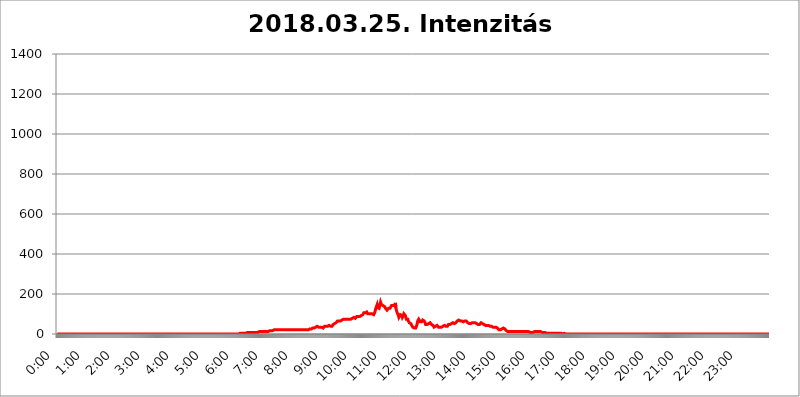
| Category | 2018.03.25. Intenzitás [W/m^2] |
|---|---|
| 0.0 | 0 |
| 0.0006944444444444445 | 0 |
| 0.001388888888888889 | 0 |
| 0.0020833333333333333 | 0 |
| 0.002777777777777778 | 0 |
| 0.003472222222222222 | 0 |
| 0.004166666666666667 | 0 |
| 0.004861111111111111 | 0 |
| 0.005555555555555556 | 0 |
| 0.0062499999999999995 | 0 |
| 0.006944444444444444 | 0 |
| 0.007638888888888889 | 0 |
| 0.008333333333333333 | 0 |
| 0.009027777777777779 | 0 |
| 0.009722222222222222 | 0 |
| 0.010416666666666666 | 0 |
| 0.011111111111111112 | 0 |
| 0.011805555555555555 | 0 |
| 0.012499999999999999 | 0 |
| 0.013194444444444444 | 0 |
| 0.013888888888888888 | 0 |
| 0.014583333333333332 | 0 |
| 0.015277777777777777 | 0 |
| 0.015972222222222224 | 0 |
| 0.016666666666666666 | 0 |
| 0.017361111111111112 | 0 |
| 0.018055555555555557 | 0 |
| 0.01875 | 0 |
| 0.019444444444444445 | 0 |
| 0.02013888888888889 | 0 |
| 0.020833333333333332 | 0 |
| 0.02152777777777778 | 0 |
| 0.022222222222222223 | 0 |
| 0.02291666666666667 | 0 |
| 0.02361111111111111 | 0 |
| 0.024305555555555556 | 0 |
| 0.024999999999999998 | 0 |
| 0.025694444444444447 | 0 |
| 0.02638888888888889 | 0 |
| 0.027083333333333334 | 0 |
| 0.027777777777777776 | 0 |
| 0.02847222222222222 | 0 |
| 0.029166666666666664 | 0 |
| 0.029861111111111113 | 0 |
| 0.030555555555555555 | 0 |
| 0.03125 | 0 |
| 0.03194444444444445 | 0 |
| 0.03263888888888889 | 0 |
| 0.03333333333333333 | 0 |
| 0.034027777777777775 | 0 |
| 0.034722222222222224 | 0 |
| 0.035416666666666666 | 0 |
| 0.036111111111111115 | 0 |
| 0.03680555555555556 | 0 |
| 0.0375 | 0 |
| 0.03819444444444444 | 0 |
| 0.03888888888888889 | 0 |
| 0.03958333333333333 | 0 |
| 0.04027777777777778 | 0 |
| 0.04097222222222222 | 0 |
| 0.041666666666666664 | 0 |
| 0.042361111111111106 | 0 |
| 0.04305555555555556 | 0 |
| 0.043750000000000004 | 0 |
| 0.044444444444444446 | 0 |
| 0.04513888888888889 | 0 |
| 0.04583333333333334 | 0 |
| 0.04652777777777778 | 0 |
| 0.04722222222222222 | 0 |
| 0.04791666666666666 | 0 |
| 0.04861111111111111 | 0 |
| 0.049305555555555554 | 0 |
| 0.049999999999999996 | 0 |
| 0.05069444444444445 | 0 |
| 0.051388888888888894 | 0 |
| 0.052083333333333336 | 0 |
| 0.05277777777777778 | 0 |
| 0.05347222222222222 | 0 |
| 0.05416666666666667 | 0 |
| 0.05486111111111111 | 0 |
| 0.05555555555555555 | 0 |
| 0.05625 | 0 |
| 0.05694444444444444 | 0 |
| 0.057638888888888885 | 0 |
| 0.05833333333333333 | 0 |
| 0.05902777777777778 | 0 |
| 0.059722222222222225 | 0 |
| 0.06041666666666667 | 0 |
| 0.061111111111111116 | 0 |
| 0.06180555555555556 | 0 |
| 0.0625 | 0 |
| 0.06319444444444444 | 0 |
| 0.06388888888888888 | 0 |
| 0.06458333333333334 | 0 |
| 0.06527777777777778 | 0 |
| 0.06597222222222222 | 0 |
| 0.06666666666666667 | 0 |
| 0.06736111111111111 | 0 |
| 0.06805555555555555 | 0 |
| 0.06874999999999999 | 0 |
| 0.06944444444444443 | 0 |
| 0.07013888888888889 | 0 |
| 0.07083333333333333 | 0 |
| 0.07152777777777779 | 0 |
| 0.07222222222222223 | 0 |
| 0.07291666666666667 | 0 |
| 0.07361111111111111 | 0 |
| 0.07430555555555556 | 0 |
| 0.075 | 0 |
| 0.07569444444444444 | 0 |
| 0.0763888888888889 | 0 |
| 0.07708333333333334 | 0 |
| 0.07777777777777778 | 0 |
| 0.07847222222222222 | 0 |
| 0.07916666666666666 | 0 |
| 0.0798611111111111 | 0 |
| 0.08055555555555556 | 0 |
| 0.08125 | 0 |
| 0.08194444444444444 | 0 |
| 0.08263888888888889 | 0 |
| 0.08333333333333333 | 0 |
| 0.08402777777777777 | 0 |
| 0.08472222222222221 | 0 |
| 0.08541666666666665 | 0 |
| 0.08611111111111112 | 0 |
| 0.08680555555555557 | 0 |
| 0.08750000000000001 | 0 |
| 0.08819444444444445 | 0 |
| 0.08888888888888889 | 0 |
| 0.08958333333333333 | 0 |
| 0.09027777777777778 | 0 |
| 0.09097222222222222 | 0 |
| 0.09166666666666667 | 0 |
| 0.09236111111111112 | 0 |
| 0.09305555555555556 | 0 |
| 0.09375 | 0 |
| 0.09444444444444444 | 0 |
| 0.09513888888888888 | 0 |
| 0.09583333333333333 | 0 |
| 0.09652777777777777 | 0 |
| 0.09722222222222222 | 0 |
| 0.09791666666666667 | 0 |
| 0.09861111111111111 | 0 |
| 0.09930555555555555 | 0 |
| 0.09999999999999999 | 0 |
| 0.10069444444444443 | 0 |
| 0.1013888888888889 | 0 |
| 0.10208333333333335 | 0 |
| 0.10277777777777779 | 0 |
| 0.10347222222222223 | 0 |
| 0.10416666666666667 | 0 |
| 0.10486111111111111 | 0 |
| 0.10555555555555556 | 0 |
| 0.10625 | 0 |
| 0.10694444444444444 | 0 |
| 0.1076388888888889 | 0 |
| 0.10833333333333334 | 0 |
| 0.10902777777777778 | 0 |
| 0.10972222222222222 | 0 |
| 0.1111111111111111 | 0 |
| 0.11180555555555556 | 0 |
| 0.11180555555555556 | 0 |
| 0.1125 | 0 |
| 0.11319444444444444 | 0 |
| 0.11388888888888889 | 0 |
| 0.11458333333333333 | 0 |
| 0.11527777777777777 | 0 |
| 0.11597222222222221 | 0 |
| 0.11666666666666665 | 0 |
| 0.1173611111111111 | 0 |
| 0.11805555555555557 | 0 |
| 0.11944444444444445 | 0 |
| 0.12013888888888889 | 0 |
| 0.12083333333333333 | 0 |
| 0.12152777777777778 | 0 |
| 0.12222222222222223 | 0 |
| 0.12291666666666667 | 0 |
| 0.12291666666666667 | 0 |
| 0.12361111111111112 | 0 |
| 0.12430555555555556 | 0 |
| 0.125 | 0 |
| 0.12569444444444444 | 0 |
| 0.12638888888888888 | 0 |
| 0.12708333333333333 | 0 |
| 0.16875 | 0 |
| 0.12847222222222224 | 0 |
| 0.12916666666666668 | 0 |
| 0.12986111111111112 | 0 |
| 0.13055555555555556 | 0 |
| 0.13125 | 0 |
| 0.13194444444444445 | 0 |
| 0.1326388888888889 | 0 |
| 0.13333333333333333 | 0 |
| 0.13402777777777777 | 0 |
| 0.13402777777777777 | 0 |
| 0.13472222222222222 | 0 |
| 0.13541666666666666 | 0 |
| 0.1361111111111111 | 0 |
| 0.13749999999999998 | 0 |
| 0.13819444444444443 | 0 |
| 0.1388888888888889 | 0 |
| 0.13958333333333334 | 0 |
| 0.14027777777777778 | 0 |
| 0.14097222222222222 | 0 |
| 0.14166666666666666 | 0 |
| 0.1423611111111111 | 0 |
| 0.14305555555555557 | 0 |
| 0.14375000000000002 | 0 |
| 0.14444444444444446 | 0 |
| 0.1451388888888889 | 0 |
| 0.1451388888888889 | 0 |
| 0.14652777777777778 | 0 |
| 0.14722222222222223 | 0 |
| 0.14791666666666667 | 0 |
| 0.1486111111111111 | 0 |
| 0.14930555555555555 | 0 |
| 0.15 | 0 |
| 0.15069444444444444 | 0 |
| 0.15138888888888888 | 0 |
| 0.15208333333333332 | 0 |
| 0.15277777777777776 | 0 |
| 0.15347222222222223 | 0 |
| 0.15416666666666667 | 0 |
| 0.15486111111111112 | 0 |
| 0.15555555555555556 | 0 |
| 0.15625 | 0 |
| 0.15694444444444444 | 0 |
| 0.15763888888888888 | 0 |
| 0.15833333333333333 | 0 |
| 0.15902777777777777 | 0 |
| 0.15972222222222224 | 0 |
| 0.16041666666666668 | 0 |
| 0.16111111111111112 | 0 |
| 0.16180555555555556 | 0 |
| 0.1625 | 0 |
| 0.16319444444444445 | 0 |
| 0.1638888888888889 | 0 |
| 0.16458333333333333 | 0 |
| 0.16527777777777777 | 0 |
| 0.16597222222222222 | 0 |
| 0.16666666666666666 | 0 |
| 0.1673611111111111 | 0 |
| 0.16805555555555554 | 0 |
| 0.16874999999999998 | 0 |
| 0.16944444444444443 | 0 |
| 0.17013888888888887 | 0 |
| 0.1708333333333333 | 0 |
| 0.17152777777777775 | 0 |
| 0.17222222222222225 | 0 |
| 0.1729166666666667 | 0 |
| 0.17361111111111113 | 0 |
| 0.17430555555555557 | 0 |
| 0.17500000000000002 | 0 |
| 0.17569444444444446 | 0 |
| 0.1763888888888889 | 0 |
| 0.17708333333333334 | 0 |
| 0.17777777777777778 | 0 |
| 0.17847222222222223 | 0 |
| 0.17916666666666667 | 0 |
| 0.1798611111111111 | 0 |
| 0.18055555555555555 | 0 |
| 0.18125 | 0 |
| 0.18194444444444444 | 0 |
| 0.1826388888888889 | 0 |
| 0.18333333333333335 | 0 |
| 0.1840277777777778 | 0 |
| 0.18472222222222223 | 0 |
| 0.18541666666666667 | 0 |
| 0.18611111111111112 | 0 |
| 0.18680555555555556 | 0 |
| 0.1875 | 0 |
| 0.18819444444444444 | 0 |
| 0.18888888888888888 | 0 |
| 0.18958333333333333 | 0 |
| 0.19027777777777777 | 0 |
| 0.1909722222222222 | 0 |
| 0.19166666666666665 | 0 |
| 0.19236111111111112 | 0 |
| 0.19305555555555554 | 0 |
| 0.19375 | 0 |
| 0.19444444444444445 | 0 |
| 0.1951388888888889 | 0 |
| 0.19583333333333333 | 0 |
| 0.19652777777777777 | 0 |
| 0.19722222222222222 | 0 |
| 0.19791666666666666 | 0 |
| 0.1986111111111111 | 0 |
| 0.19930555555555554 | 0 |
| 0.19999999999999998 | 0 |
| 0.20069444444444443 | 0 |
| 0.20138888888888887 | 0 |
| 0.2020833333333333 | 0 |
| 0.2027777777777778 | 0 |
| 0.2034722222222222 | 0 |
| 0.2041666666666667 | 0 |
| 0.20486111111111113 | 0 |
| 0.20555555555555557 | 0 |
| 0.20625000000000002 | 0 |
| 0.20694444444444446 | 0 |
| 0.2076388888888889 | 0 |
| 0.20833333333333334 | 0 |
| 0.20902777777777778 | 0 |
| 0.20972222222222223 | 0 |
| 0.21041666666666667 | 0 |
| 0.2111111111111111 | 0 |
| 0.21180555555555555 | 0 |
| 0.2125 | 0 |
| 0.21319444444444444 | 0 |
| 0.2138888888888889 | 0 |
| 0.21458333333333335 | 0 |
| 0.2152777777777778 | 0 |
| 0.21597222222222223 | 0 |
| 0.21666666666666667 | 0 |
| 0.21736111111111112 | 0 |
| 0.21805555555555556 | 0 |
| 0.21875 | 0 |
| 0.21944444444444444 | 0 |
| 0.22013888888888888 | 0 |
| 0.22083333333333333 | 0 |
| 0.22152777777777777 | 0 |
| 0.2222222222222222 | 0 |
| 0.22291666666666665 | 0 |
| 0.2236111111111111 | 0 |
| 0.22430555555555556 | 0 |
| 0.225 | 0 |
| 0.22569444444444445 | 0 |
| 0.2263888888888889 | 0 |
| 0.22708333333333333 | 0 |
| 0.22777777777777777 | 0 |
| 0.22847222222222222 | 0 |
| 0.22916666666666666 | 0 |
| 0.2298611111111111 | 0 |
| 0.23055555555555554 | 0 |
| 0.23124999999999998 | 0 |
| 0.23194444444444443 | 0 |
| 0.23263888888888887 | 0 |
| 0.2333333333333333 | 0 |
| 0.2340277777777778 | 0 |
| 0.2347222222222222 | 0 |
| 0.2354166666666667 | 0 |
| 0.23611111111111113 | 0 |
| 0.23680555555555557 | 0 |
| 0.23750000000000002 | 0 |
| 0.23819444444444446 | 0 |
| 0.2388888888888889 | 0 |
| 0.23958333333333334 | 0 |
| 0.24027777777777778 | 0 |
| 0.24097222222222223 | 0 |
| 0.24166666666666667 | 0 |
| 0.2423611111111111 | 0 |
| 0.24305555555555555 | 0 |
| 0.24375 | 0 |
| 0.24444444444444446 | 0 |
| 0.24513888888888888 | 0 |
| 0.24583333333333335 | 0 |
| 0.2465277777777778 | 0 |
| 0.24722222222222223 | 0 |
| 0.24791666666666667 | 0 |
| 0.24861111111111112 | 0 |
| 0.24930555555555556 | 0 |
| 0.25 | 0 |
| 0.25069444444444444 | 0 |
| 0.2513888888888889 | 0 |
| 0.2520833333333333 | 0 |
| 0.25277777777777777 | 0 |
| 0.2534722222222222 | 0 |
| 0.25416666666666665 | 0 |
| 0.2548611111111111 | 3.525 |
| 0.2555555555555556 | 3.525 |
| 0.25625000000000003 | 3.525 |
| 0.2569444444444445 | 3.525 |
| 0.2576388888888889 | 3.525 |
| 0.25833333333333336 | 3.525 |
| 0.2590277777777778 | 3.525 |
| 0.25972222222222224 | 3.525 |
| 0.2604166666666667 | 3.525 |
| 0.2611111111111111 | 3.525 |
| 0.26180555555555557 | 3.525 |
| 0.2625 | 3.525 |
| 0.26319444444444445 | 3.525 |
| 0.2638888888888889 | 3.525 |
| 0.26458333333333334 | 3.525 |
| 0.2652777777777778 | 3.525 |
| 0.2659722222222222 | 3.525 |
| 0.26666666666666666 | 7.887 |
| 0.2673611111111111 | 7.887 |
| 0.26805555555555555 | 7.887 |
| 0.26875 | 7.887 |
| 0.26944444444444443 | 7.887 |
| 0.2701388888888889 | 7.887 |
| 0.2708333333333333 | 7.887 |
| 0.27152777777777776 | 7.887 |
| 0.2722222222222222 | 7.887 |
| 0.27291666666666664 | 7.887 |
| 0.2736111111111111 | 7.887 |
| 0.2743055555555555 | 7.887 |
| 0.27499999999999997 | 7.887 |
| 0.27569444444444446 | 7.887 |
| 0.27638888888888885 | 7.887 |
| 0.27708333333333335 | 7.887 |
| 0.2777777777777778 | 7.887 |
| 0.27847222222222223 | 7.887 |
| 0.2791666666666667 | 7.887 |
| 0.2798611111111111 | 7.887 |
| 0.28055555555555556 | 7.887 |
| 0.28125 | 7.887 |
| 0.28194444444444444 | 12.257 |
| 0.2826388888888889 | 7.887 |
| 0.2833333333333333 | 12.257 |
| 0.28402777777777777 | 12.257 |
| 0.2847222222222222 | 12.257 |
| 0.28541666666666665 | 12.257 |
| 0.28611111111111115 | 12.257 |
| 0.28680555555555554 | 12.257 |
| 0.28750000000000003 | 12.257 |
| 0.2881944444444445 | 12.257 |
| 0.2888888888888889 | 12.257 |
| 0.28958333333333336 | 12.257 |
| 0.2902777777777778 | 12.257 |
| 0.29097222222222224 | 12.257 |
| 0.2916666666666667 | 12.257 |
| 0.2923611111111111 | 12.257 |
| 0.29305555555555557 | 12.257 |
| 0.29375 | 12.257 |
| 0.29444444444444445 | 12.257 |
| 0.2951388888888889 | 12.257 |
| 0.29583333333333334 | 12.257 |
| 0.2965277777777778 | 16.636 |
| 0.2972222222222222 | 16.636 |
| 0.29791666666666666 | 16.636 |
| 0.2986111111111111 | 16.636 |
| 0.29930555555555555 | 16.636 |
| 0.3 | 16.636 |
| 0.30069444444444443 | 16.636 |
| 0.3013888888888889 | 16.636 |
| 0.3020833333333333 | 16.636 |
| 0.30277777777777776 | 16.636 |
| 0.3034722222222222 | 16.636 |
| 0.30416666666666664 | 21.024 |
| 0.3048611111111111 | 16.636 |
| 0.3055555555555555 | 21.024 |
| 0.30624999999999997 | 21.024 |
| 0.3069444444444444 | 21.024 |
| 0.3076388888888889 | 16.636 |
| 0.30833333333333335 | 21.024 |
| 0.3090277777777778 | 21.024 |
| 0.30972222222222223 | 21.024 |
| 0.3104166666666667 | 21.024 |
| 0.3111111111111111 | 21.024 |
| 0.31180555555555556 | 21.024 |
| 0.3125 | 21.024 |
| 0.31319444444444444 | 21.024 |
| 0.3138888888888889 | 21.024 |
| 0.3145833333333333 | 21.024 |
| 0.31527777777777777 | 21.024 |
| 0.3159722222222222 | 21.024 |
| 0.31666666666666665 | 21.024 |
| 0.31736111111111115 | 21.024 |
| 0.31805555555555554 | 21.024 |
| 0.31875000000000003 | 21.024 |
| 0.3194444444444445 | 21.024 |
| 0.3201388888888889 | 21.024 |
| 0.32083333333333336 | 21.024 |
| 0.3215277777777778 | 21.024 |
| 0.32222222222222224 | 21.024 |
| 0.3229166666666667 | 21.024 |
| 0.3236111111111111 | 21.024 |
| 0.32430555555555557 | 21.024 |
| 0.325 | 21.024 |
| 0.32569444444444445 | 21.024 |
| 0.3263888888888889 | 21.024 |
| 0.32708333333333334 | 21.024 |
| 0.3277777777777778 | 21.024 |
| 0.3284722222222222 | 21.024 |
| 0.32916666666666666 | 21.024 |
| 0.3298611111111111 | 21.024 |
| 0.33055555555555555 | 21.024 |
| 0.33125 | 21.024 |
| 0.33194444444444443 | 21.024 |
| 0.3326388888888889 | 21.024 |
| 0.3333333333333333 | 21.024 |
| 0.3340277777777778 | 21.024 |
| 0.3347222222222222 | 21.024 |
| 0.3354166666666667 | 21.024 |
| 0.3361111111111111 | 21.024 |
| 0.3368055555555556 | 21.024 |
| 0.33749999999999997 | 21.024 |
| 0.33819444444444446 | 21.024 |
| 0.33888888888888885 | 21.024 |
| 0.33958333333333335 | 21.024 |
| 0.34027777777777773 | 21.024 |
| 0.34097222222222223 | 21.024 |
| 0.3416666666666666 | 21.024 |
| 0.3423611111111111 | 21.024 |
| 0.3430555555555555 | 21.024 |
| 0.34375 | 21.024 |
| 0.3444444444444445 | 21.024 |
| 0.3451388888888889 | 21.024 |
| 0.3458333333333334 | 21.024 |
| 0.34652777777777777 | 21.024 |
| 0.34722222222222227 | 21.024 |
| 0.34791666666666665 | 21.024 |
| 0.34861111111111115 | 21.024 |
| 0.34930555555555554 | 21.024 |
| 0.35000000000000003 | 21.024 |
| 0.3506944444444444 | 21.024 |
| 0.3513888888888889 | 21.024 |
| 0.3520833333333333 | 21.024 |
| 0.3527777777777778 | 25.419 |
| 0.3534722222222222 | 25.419 |
| 0.3541666666666667 | 25.419 |
| 0.3548611111111111 | 25.419 |
| 0.35555555555555557 | 25.419 |
| 0.35625 | 25.419 |
| 0.35694444444444445 | 25.419 |
| 0.3576388888888889 | 29.823 |
| 0.35833333333333334 | 29.823 |
| 0.3590277777777778 | 29.823 |
| 0.3597222222222222 | 29.823 |
| 0.36041666666666666 | 29.823 |
| 0.3611111111111111 | 29.823 |
| 0.36180555555555555 | 29.823 |
| 0.3625 | 34.234 |
| 0.36319444444444443 | 34.234 |
| 0.3638888888888889 | 38.653 |
| 0.3645833333333333 | 38.653 |
| 0.3652777777777778 | 38.653 |
| 0.3659722222222222 | 34.234 |
| 0.3666666666666667 | 34.234 |
| 0.3673611111111111 | 34.234 |
| 0.3680555555555556 | 34.234 |
| 0.36874999999999997 | 34.234 |
| 0.36944444444444446 | 34.234 |
| 0.37013888888888885 | 34.234 |
| 0.37083333333333335 | 34.234 |
| 0.37152777777777773 | 29.823 |
| 0.37222222222222223 | 29.823 |
| 0.3729166666666666 | 29.823 |
| 0.3736111111111111 | 34.234 |
| 0.3743055555555555 | 34.234 |
| 0.375 | 38.653 |
| 0.3756944444444445 | 38.653 |
| 0.3763888888888889 | 34.234 |
| 0.3770833333333334 | 38.653 |
| 0.37777777777777777 | 38.653 |
| 0.37847222222222227 | 38.653 |
| 0.37916666666666665 | 38.653 |
| 0.37986111111111115 | 43.079 |
| 0.38055555555555554 | 43.079 |
| 0.38125000000000003 | 43.079 |
| 0.3819444444444444 | 43.079 |
| 0.3826388888888889 | 43.079 |
| 0.3833333333333333 | 38.653 |
| 0.3840277777777778 | 43.079 |
| 0.3847222222222222 | 43.079 |
| 0.3854166666666667 | 38.653 |
| 0.3861111111111111 | 43.079 |
| 0.38680555555555557 | 47.511 |
| 0.3875 | 47.511 |
| 0.38819444444444445 | 47.511 |
| 0.3888888888888889 | 51.951 |
| 0.38958333333333334 | 51.951 |
| 0.3902777777777778 | 56.398 |
| 0.3909722222222222 | 56.398 |
| 0.39166666666666666 | 60.85 |
| 0.3923611111111111 | 60.85 |
| 0.39305555555555555 | 65.31 |
| 0.39375 | 65.31 |
| 0.39444444444444443 | 65.31 |
| 0.3951388888888889 | 65.31 |
| 0.3958333333333333 | 69.775 |
| 0.3965277777777778 | 69.775 |
| 0.3972222222222222 | 65.31 |
| 0.3979166666666667 | 65.31 |
| 0.3986111111111111 | 65.31 |
| 0.3993055555555556 | 69.775 |
| 0.39999999999999997 | 69.775 |
| 0.40069444444444446 | 69.775 |
| 0.40138888888888885 | 74.246 |
| 0.40208333333333335 | 74.246 |
| 0.40277777777777773 | 74.246 |
| 0.40347222222222223 | 74.246 |
| 0.4041666666666666 | 74.246 |
| 0.4048611111111111 | 74.246 |
| 0.4055555555555555 | 74.246 |
| 0.40625 | 74.246 |
| 0.4069444444444445 | 74.246 |
| 0.4076388888888889 | 74.246 |
| 0.4083333333333334 | 74.246 |
| 0.40902777777777777 | 74.246 |
| 0.40972222222222227 | 74.246 |
| 0.41041666666666665 | 78.722 |
| 0.41111111111111115 | 74.246 |
| 0.41180555555555554 | 74.246 |
| 0.41250000000000003 | 74.246 |
| 0.4131944444444444 | 78.722 |
| 0.4138888888888889 | 78.722 |
| 0.4145833333333333 | 83.205 |
| 0.4152777777777778 | 83.205 |
| 0.4159722222222222 | 83.205 |
| 0.4166666666666667 | 83.205 |
| 0.4173611111111111 | 78.722 |
| 0.41805555555555557 | 78.722 |
| 0.41875 | 78.722 |
| 0.41944444444444445 | 83.205 |
| 0.4201388888888889 | 87.692 |
| 0.42083333333333334 | 87.692 |
| 0.4215277777777778 | 92.184 |
| 0.4222222222222222 | 87.692 |
| 0.42291666666666666 | 87.692 |
| 0.4236111111111111 | 92.184 |
| 0.42430555555555555 | 87.692 |
| 0.425 | 87.692 |
| 0.42569444444444443 | 87.692 |
| 0.4263888888888889 | 92.184 |
| 0.4270833333333333 | 92.184 |
| 0.4277777777777778 | 92.184 |
| 0.4284722222222222 | 96.682 |
| 0.4291666666666667 | 101.184 |
| 0.4298611111111111 | 105.69 |
| 0.4305555555555556 | 110.201 |
| 0.43124999999999997 | 110.201 |
| 0.43194444444444446 | 105.69 |
| 0.43263888888888885 | 105.69 |
| 0.43333333333333335 | 105.69 |
| 0.43402777777777773 | 110.201 |
| 0.43472222222222223 | 105.69 |
| 0.4354166666666666 | 101.184 |
| 0.4361111111111111 | 101.184 |
| 0.4368055555555555 | 101.184 |
| 0.4375 | 101.184 |
| 0.4381944444444445 | 105.69 |
| 0.4388888888888889 | 105.69 |
| 0.4395833333333334 | 101.184 |
| 0.44027777777777777 | 101.184 |
| 0.44097222222222227 | 101.184 |
| 0.44166666666666665 | 101.184 |
| 0.44236111111111115 | 96.682 |
| 0.44305555555555554 | 96.682 |
| 0.44375000000000003 | 96.682 |
| 0.4444444444444444 | 101.184 |
| 0.4451388888888889 | 105.69 |
| 0.4458333333333333 | 114.716 |
| 0.4465277777777778 | 119.235 |
| 0.4472222222222222 | 132.814 |
| 0.4479166666666667 | 128.284 |
| 0.4486111111111111 | 146.423 |
| 0.44930555555555557 | 132.814 |
| 0.45 | 132.814 |
| 0.45069444444444445 | 132.814 |
| 0.4513888888888889 | 128.284 |
| 0.45208333333333334 | 137.347 |
| 0.4527777777777778 | 141.884 |
| 0.4534722222222222 | 160.056 |
| 0.45416666666666666 | 155.509 |
| 0.4548611111111111 | 146.423 |
| 0.45555555555555555 | 146.423 |
| 0.45625 | 141.884 |
| 0.45694444444444443 | 141.884 |
| 0.4576388888888889 | 146.423 |
| 0.4583333333333333 | 137.347 |
| 0.4590277777777778 | 137.347 |
| 0.4597222222222222 | 137.347 |
| 0.4604166666666667 | 128.284 |
| 0.4611111111111111 | 123.758 |
| 0.4618055555555556 | 123.758 |
| 0.46249999999999997 | 119.235 |
| 0.46319444444444446 | 119.235 |
| 0.46388888888888885 | 119.235 |
| 0.46458333333333335 | 128.284 |
| 0.46527777777777773 | 128.284 |
| 0.46597222222222223 | 132.814 |
| 0.4666666666666666 | 128.284 |
| 0.4673611111111111 | 123.758 |
| 0.4680555555555555 | 128.284 |
| 0.46875 | 141.884 |
| 0.4694444444444445 | 141.884 |
| 0.4701388888888889 | 141.884 |
| 0.4708333333333334 | 141.884 |
| 0.47152777777777777 | 141.884 |
| 0.47222222222222227 | 146.423 |
| 0.47291666666666665 | 141.884 |
| 0.47361111111111115 | 141.884 |
| 0.47430555555555554 | 155.509 |
| 0.47500000000000003 | 128.284 |
| 0.4756944444444444 | 119.235 |
| 0.4763888888888889 | 110.201 |
| 0.4770833333333333 | 110.201 |
| 0.4777777777777778 | 105.69 |
| 0.4784722222222222 | 92.184 |
| 0.4791666666666667 | 83.205 |
| 0.4798611111111111 | 83.205 |
| 0.48055555555555557 | 87.692 |
| 0.48125 | 96.682 |
| 0.48194444444444445 | 101.184 |
| 0.4826388888888889 | 101.184 |
| 0.48333333333333334 | 92.184 |
| 0.4840277777777778 | 83.205 |
| 0.4847222222222222 | 83.205 |
| 0.48541666666666666 | 92.184 |
| 0.4861111111111111 | 101.184 |
| 0.48680555555555555 | 105.69 |
| 0.4875 | 101.184 |
| 0.48819444444444443 | 92.184 |
| 0.4888888888888889 | 83.205 |
| 0.4895833333333333 | 74.246 |
| 0.4902777777777778 | 78.722 |
| 0.4909722222222222 | 74.246 |
| 0.4916666666666667 | 74.246 |
| 0.4923611111111111 | 65.31 |
| 0.4930555555555556 | 60.85 |
| 0.49374999999999997 | 56.398 |
| 0.49444444444444446 | 56.398 |
| 0.49513888888888885 | 56.398 |
| 0.49583333333333335 | 51.951 |
| 0.49652777777777773 | 47.511 |
| 0.49722222222222223 | 43.079 |
| 0.4979166666666666 | 38.653 |
| 0.4986111111111111 | 34.234 |
| 0.4993055555555555 | 34.234 |
| 0.5 | 29.823 |
| 0.5006944444444444 | 29.823 |
| 0.5013888888888889 | 29.823 |
| 0.5020833333333333 | 29.823 |
| 0.5027777777777778 | 29.823 |
| 0.5034722222222222 | 34.234 |
| 0.5041666666666667 | 43.079 |
| 0.5048611111111111 | 51.951 |
| 0.5055555555555555 | 65.31 |
| 0.50625 | 69.775 |
| 0.5069444444444444 | 74.246 |
| 0.5076388888888889 | 78.722 |
| 0.5083333333333333 | 69.775 |
| 0.5090277777777777 | 60.85 |
| 0.5097222222222222 | 56.398 |
| 0.5104166666666666 | 56.398 |
| 0.5111111111111112 | 60.85 |
| 0.5118055555555555 | 65.31 |
| 0.5125000000000001 | 69.775 |
| 0.5131944444444444 | 69.775 |
| 0.513888888888889 | 65.31 |
| 0.5145833333333333 | 65.31 |
| 0.5152777777777778 | 60.85 |
| 0.5159722222222222 | 56.398 |
| 0.5166666666666667 | 47.511 |
| 0.517361111111111 | 51.951 |
| 0.5180555555555556 | 51.951 |
| 0.5187499999999999 | 47.511 |
| 0.5194444444444445 | 51.951 |
| 0.5201388888888888 | 51.951 |
| 0.5208333333333334 | 51.951 |
| 0.5215277777777778 | 56.398 |
| 0.5222222222222223 | 56.398 |
| 0.5229166666666667 | 56.398 |
| 0.5236111111111111 | 56.398 |
| 0.5243055555555556 | 51.951 |
| 0.525 | 47.511 |
| 0.5256944444444445 | 47.511 |
| 0.5263888888888889 | 43.079 |
| 0.5270833333333333 | 43.079 |
| 0.5277777777777778 | 38.653 |
| 0.5284722222222222 | 34.234 |
| 0.5291666666666667 | 34.234 |
| 0.5298611111111111 | 38.653 |
| 0.5305555555555556 | 38.653 |
| 0.53125 | 38.653 |
| 0.5319444444444444 | 43.079 |
| 0.5326388888888889 | 43.079 |
| 0.5333333333333333 | 43.079 |
| 0.5340277777777778 | 38.653 |
| 0.5347222222222222 | 34.234 |
| 0.5354166666666667 | 34.234 |
| 0.5361111111111111 | 34.234 |
| 0.5368055555555555 | 34.234 |
| 0.5375 | 34.234 |
| 0.5381944444444444 | 34.234 |
| 0.5388888888888889 | 34.234 |
| 0.5395833333333333 | 38.653 |
| 0.5402777777777777 | 38.653 |
| 0.5409722222222222 | 38.653 |
| 0.5416666666666666 | 43.079 |
| 0.5423611111111112 | 43.079 |
| 0.5430555555555555 | 43.079 |
| 0.5437500000000001 | 43.079 |
| 0.5444444444444444 | 38.653 |
| 0.545138888888889 | 38.653 |
| 0.5458333333333333 | 34.234 |
| 0.5465277777777778 | 34.234 |
| 0.5472222222222222 | 38.653 |
| 0.5479166666666667 | 43.079 |
| 0.548611111111111 | 47.511 |
| 0.5493055555555556 | 47.511 |
| 0.5499999999999999 | 47.511 |
| 0.5506944444444445 | 47.511 |
| 0.5513888888888888 | 47.511 |
| 0.5520833333333334 | 51.951 |
| 0.5527777777777778 | 51.951 |
| 0.5534722222222223 | 56.398 |
| 0.5541666666666667 | 56.398 |
| 0.5548611111111111 | 56.398 |
| 0.5555555555555556 | 56.398 |
| 0.55625 | 56.398 |
| 0.5569444444444445 | 51.951 |
| 0.5576388888888889 | 51.951 |
| 0.5583333333333333 | 51.951 |
| 0.5590277777777778 | 56.398 |
| 0.5597222222222222 | 60.85 |
| 0.5604166666666667 | 60.85 |
| 0.5611111111111111 | 65.31 |
| 0.5618055555555556 | 65.31 |
| 0.5625 | 65.31 |
| 0.5631944444444444 | 69.775 |
| 0.5638888888888889 | 69.775 |
| 0.5645833333333333 | 69.775 |
| 0.5652777777777778 | 65.31 |
| 0.5659722222222222 | 65.31 |
| 0.5666666666666667 | 65.31 |
| 0.5673611111111111 | 65.31 |
| 0.5680555555555555 | 65.31 |
| 0.56875 | 65.31 |
| 0.5694444444444444 | 60.85 |
| 0.5701388888888889 | 60.85 |
| 0.5708333333333333 | 65.31 |
| 0.5715277777777777 | 65.31 |
| 0.5722222222222222 | 65.31 |
| 0.5729166666666666 | 65.31 |
| 0.5736111111111112 | 65.31 |
| 0.5743055555555555 | 65.31 |
| 0.5750000000000001 | 60.85 |
| 0.5756944444444444 | 56.398 |
| 0.576388888888889 | 56.398 |
| 0.5770833333333333 | 51.951 |
| 0.5777777777777778 | 51.951 |
| 0.5784722222222222 | 51.951 |
| 0.5791666666666667 | 51.951 |
| 0.579861111111111 | 51.951 |
| 0.5805555555555556 | 51.951 |
| 0.5812499999999999 | 51.951 |
| 0.5819444444444445 | 56.398 |
| 0.5826388888888888 | 56.398 |
| 0.5833333333333334 | 56.398 |
| 0.5840277777777778 | 56.398 |
| 0.5847222222222223 | 56.398 |
| 0.5854166666666667 | 56.398 |
| 0.5861111111111111 | 56.398 |
| 0.5868055555555556 | 56.398 |
| 0.5875 | 51.951 |
| 0.5881944444444445 | 51.951 |
| 0.5888888888888889 | 47.511 |
| 0.5895833333333333 | 47.511 |
| 0.5902777777777778 | 47.511 |
| 0.5909722222222222 | 47.511 |
| 0.5916666666666667 | 47.511 |
| 0.5923611111111111 | 47.511 |
| 0.5930555555555556 | 51.951 |
| 0.59375 | 51.951 |
| 0.5944444444444444 | 56.398 |
| 0.5951388888888889 | 56.398 |
| 0.5958333333333333 | 51.951 |
| 0.5965277777777778 | 51.951 |
| 0.5972222222222222 | 47.511 |
| 0.5979166666666667 | 47.511 |
| 0.5986111111111111 | 47.511 |
| 0.5993055555555555 | 47.511 |
| 0.6 | 43.079 |
| 0.6006944444444444 | 43.079 |
| 0.6013888888888889 | 38.653 |
| 0.6020833333333333 | 43.079 |
| 0.6027777777777777 | 43.079 |
| 0.6034722222222222 | 43.079 |
| 0.6041666666666666 | 43.079 |
| 0.6048611111111112 | 43.079 |
| 0.6055555555555555 | 43.079 |
| 0.6062500000000001 | 38.653 |
| 0.6069444444444444 | 38.653 |
| 0.607638888888889 | 38.653 |
| 0.6083333333333333 | 38.653 |
| 0.6090277777777778 | 38.653 |
| 0.6097222222222222 | 34.234 |
| 0.6104166666666667 | 34.234 |
| 0.611111111111111 | 34.234 |
| 0.6118055555555556 | 34.234 |
| 0.6124999999999999 | 34.234 |
| 0.6131944444444445 | 34.234 |
| 0.6138888888888888 | 34.234 |
| 0.6145833333333334 | 34.234 |
| 0.6152777777777778 | 34.234 |
| 0.6159722222222223 | 34.234 |
| 0.6166666666666667 | 34.234 |
| 0.6173611111111111 | 29.823 |
| 0.6180555555555556 | 29.823 |
| 0.61875 | 25.419 |
| 0.6194444444444445 | 21.024 |
| 0.6201388888888889 | 21.024 |
| 0.6208333333333333 | 21.024 |
| 0.6215277777777778 | 21.024 |
| 0.6222222222222222 | 21.024 |
| 0.6229166666666667 | 21.024 |
| 0.6236111111111111 | 25.419 |
| 0.6243055555555556 | 25.419 |
| 0.625 | 25.419 |
| 0.6256944444444444 | 29.823 |
| 0.6263888888888889 | 29.823 |
| 0.6270833333333333 | 25.419 |
| 0.6277777777777778 | 25.419 |
| 0.6284722222222222 | 21.024 |
| 0.6291666666666667 | 21.024 |
| 0.6298611111111111 | 16.636 |
| 0.6305555555555555 | 16.636 |
| 0.63125 | 16.636 |
| 0.6319444444444444 | 12.257 |
| 0.6326388888888889 | 12.257 |
| 0.6333333333333333 | 12.257 |
| 0.6340277777777777 | 12.257 |
| 0.6347222222222222 | 12.257 |
| 0.6354166666666666 | 12.257 |
| 0.6361111111111112 | 12.257 |
| 0.6368055555555555 | 12.257 |
| 0.6375000000000001 | 12.257 |
| 0.6381944444444444 | 12.257 |
| 0.638888888888889 | 12.257 |
| 0.6395833333333333 | 12.257 |
| 0.6402777777777778 | 12.257 |
| 0.6409722222222222 | 12.257 |
| 0.6416666666666667 | 12.257 |
| 0.642361111111111 | 12.257 |
| 0.6430555555555556 | 12.257 |
| 0.6437499999999999 | 12.257 |
| 0.6444444444444445 | 12.257 |
| 0.6451388888888888 | 12.257 |
| 0.6458333333333334 | 12.257 |
| 0.6465277777777778 | 12.257 |
| 0.6472222222222223 | 12.257 |
| 0.6479166666666667 | 12.257 |
| 0.6486111111111111 | 12.257 |
| 0.6493055555555556 | 12.257 |
| 0.65 | 12.257 |
| 0.6506944444444445 | 12.257 |
| 0.6513888888888889 | 12.257 |
| 0.6520833333333333 | 12.257 |
| 0.6527777777777778 | 12.257 |
| 0.6534722222222222 | 12.257 |
| 0.6541666666666667 | 12.257 |
| 0.6548611111111111 | 12.257 |
| 0.6555555555555556 | 12.257 |
| 0.65625 | 12.257 |
| 0.6569444444444444 | 12.257 |
| 0.6576388888888889 | 12.257 |
| 0.6583333333333333 | 12.257 |
| 0.6590277777777778 | 12.257 |
| 0.6597222222222222 | 12.257 |
| 0.6604166666666667 | 12.257 |
| 0.6611111111111111 | 12.257 |
| 0.6618055555555555 | 7.887 |
| 0.6625 | 7.887 |
| 0.6631944444444444 | 7.887 |
| 0.6638888888888889 | 7.887 |
| 0.6645833333333333 | 7.887 |
| 0.6652777777777777 | 7.887 |
| 0.6659722222222222 | 7.887 |
| 0.6666666666666666 | 7.887 |
| 0.6673611111111111 | 7.887 |
| 0.6680555555555556 | 12.257 |
| 0.6687500000000001 | 12.257 |
| 0.6694444444444444 | 12.257 |
| 0.6701388888888888 | 12.257 |
| 0.6708333333333334 | 12.257 |
| 0.6715277777777778 | 12.257 |
| 0.6722222222222222 | 12.257 |
| 0.6729166666666666 | 12.257 |
| 0.6736111111111112 | 12.257 |
| 0.6743055555555556 | 12.257 |
| 0.6749999999999999 | 12.257 |
| 0.6756944444444444 | 12.257 |
| 0.6763888888888889 | 12.257 |
| 0.6770833333333334 | 7.887 |
| 0.6777777777777777 | 12.257 |
| 0.6784722222222223 | 7.887 |
| 0.6791666666666667 | 7.887 |
| 0.6798611111111111 | 7.887 |
| 0.6805555555555555 | 7.887 |
| 0.68125 | 7.887 |
| 0.6819444444444445 | 7.887 |
| 0.6826388888888889 | 7.887 |
| 0.6833333333333332 | 7.887 |
| 0.6840277777777778 | 7.887 |
| 0.6847222222222222 | 7.887 |
| 0.6854166666666667 | 7.887 |
| 0.686111111111111 | 3.525 |
| 0.6868055555555556 | 3.525 |
| 0.6875 | 3.525 |
| 0.6881944444444444 | 3.525 |
| 0.688888888888889 | 3.525 |
| 0.6895833333333333 | 3.525 |
| 0.6902777777777778 | 3.525 |
| 0.6909722222222222 | 3.525 |
| 0.6916666666666668 | 3.525 |
| 0.6923611111111111 | 3.525 |
| 0.6930555555555555 | 3.525 |
| 0.69375 | 3.525 |
| 0.6944444444444445 | 3.525 |
| 0.6951388888888889 | 3.525 |
| 0.6958333333333333 | 3.525 |
| 0.6965277777777777 | 3.525 |
| 0.6972222222222223 | 3.525 |
| 0.6979166666666666 | 3.525 |
| 0.6986111111111111 | 3.525 |
| 0.6993055555555556 | 3.525 |
| 0.7000000000000001 | 3.525 |
| 0.7006944444444444 | 3.525 |
| 0.7013888888888888 | 3.525 |
| 0.7020833333333334 | 3.525 |
| 0.7027777777777778 | 3.525 |
| 0.7034722222222222 | 3.525 |
| 0.7041666666666666 | 3.525 |
| 0.7048611111111112 | 3.525 |
| 0.7055555555555556 | 3.525 |
| 0.7062499999999999 | 3.525 |
| 0.7069444444444444 | 3.525 |
| 0.7076388888888889 | 3.525 |
| 0.7083333333333334 | 3.525 |
| 0.7090277777777777 | 0 |
| 0.7097222222222223 | 3.525 |
| 0.7104166666666667 | 0 |
| 0.7111111111111111 | 3.525 |
| 0.7118055555555555 | 0 |
| 0.7125 | 0 |
| 0.7131944444444445 | 0 |
| 0.7138888888888889 | 0 |
| 0.7145833333333332 | 0 |
| 0.7152777777777778 | 0 |
| 0.7159722222222222 | 0 |
| 0.7166666666666667 | 0 |
| 0.717361111111111 | 0 |
| 0.7180555555555556 | 0 |
| 0.71875 | 0 |
| 0.7194444444444444 | 0 |
| 0.720138888888889 | 0 |
| 0.7208333333333333 | 0 |
| 0.7215277777777778 | 0 |
| 0.7222222222222222 | 0 |
| 0.7229166666666668 | 0 |
| 0.7236111111111111 | 0 |
| 0.7243055555555555 | 0 |
| 0.725 | 0 |
| 0.7256944444444445 | 0 |
| 0.7263888888888889 | 0 |
| 0.7270833333333333 | 0 |
| 0.7277777777777777 | 0 |
| 0.7284722222222223 | 0 |
| 0.7291666666666666 | 0 |
| 0.7298611111111111 | 0 |
| 0.7305555555555556 | 0 |
| 0.7312500000000001 | 0 |
| 0.7319444444444444 | 0 |
| 0.7326388888888888 | 0 |
| 0.7333333333333334 | 0 |
| 0.7340277777777778 | 0 |
| 0.7347222222222222 | 0 |
| 0.7354166666666666 | 0 |
| 0.7361111111111112 | 0 |
| 0.7368055555555556 | 0 |
| 0.7374999999999999 | 0 |
| 0.7381944444444444 | 0 |
| 0.7388888888888889 | 0 |
| 0.7395833333333334 | 0 |
| 0.7402777777777777 | 0 |
| 0.7409722222222223 | 0 |
| 0.7416666666666667 | 0 |
| 0.7423611111111111 | 0 |
| 0.7430555555555555 | 0 |
| 0.74375 | 0 |
| 0.7444444444444445 | 0 |
| 0.7451388888888889 | 0 |
| 0.7458333333333332 | 0 |
| 0.7465277777777778 | 0 |
| 0.7472222222222222 | 0 |
| 0.7479166666666667 | 0 |
| 0.748611111111111 | 0 |
| 0.7493055555555556 | 0 |
| 0.75 | 0 |
| 0.7506944444444444 | 0 |
| 0.751388888888889 | 0 |
| 0.7520833333333333 | 0 |
| 0.7527777777777778 | 0 |
| 0.7534722222222222 | 0 |
| 0.7541666666666668 | 0 |
| 0.7548611111111111 | 0 |
| 0.7555555555555555 | 0 |
| 0.75625 | 0 |
| 0.7569444444444445 | 0 |
| 0.7576388888888889 | 0 |
| 0.7583333333333333 | 0 |
| 0.7590277777777777 | 0 |
| 0.7597222222222223 | 0 |
| 0.7604166666666666 | 0 |
| 0.7611111111111111 | 0 |
| 0.7618055555555556 | 0 |
| 0.7625000000000001 | 0 |
| 0.7631944444444444 | 0 |
| 0.7638888888888888 | 0 |
| 0.7645833333333334 | 0 |
| 0.7652777777777778 | 0 |
| 0.7659722222222222 | 0 |
| 0.7666666666666666 | 0 |
| 0.7673611111111112 | 0 |
| 0.7680555555555556 | 0 |
| 0.7687499999999999 | 0 |
| 0.7694444444444444 | 0 |
| 0.7701388888888889 | 0 |
| 0.7708333333333334 | 0 |
| 0.7715277777777777 | 0 |
| 0.7722222222222223 | 0 |
| 0.7729166666666667 | 0 |
| 0.7736111111111111 | 0 |
| 0.7743055555555555 | 0 |
| 0.775 | 0 |
| 0.7756944444444445 | 0 |
| 0.7763888888888889 | 0 |
| 0.7770833333333332 | 0 |
| 0.7777777777777778 | 0 |
| 0.7784722222222222 | 0 |
| 0.7791666666666667 | 0 |
| 0.779861111111111 | 0 |
| 0.7805555555555556 | 0 |
| 0.78125 | 0 |
| 0.7819444444444444 | 0 |
| 0.782638888888889 | 0 |
| 0.7833333333333333 | 0 |
| 0.7840277777777778 | 0 |
| 0.7847222222222222 | 0 |
| 0.7854166666666668 | 0 |
| 0.7861111111111111 | 0 |
| 0.7868055555555555 | 0 |
| 0.7875 | 0 |
| 0.7881944444444445 | 0 |
| 0.7888888888888889 | 0 |
| 0.7895833333333333 | 0 |
| 0.7902777777777777 | 0 |
| 0.7909722222222223 | 0 |
| 0.7916666666666666 | 0 |
| 0.7923611111111111 | 0 |
| 0.7930555555555556 | 0 |
| 0.7937500000000001 | 0 |
| 0.7944444444444444 | 0 |
| 0.7951388888888888 | 0 |
| 0.7958333333333334 | 0 |
| 0.7965277777777778 | 0 |
| 0.7972222222222222 | 0 |
| 0.7979166666666666 | 0 |
| 0.7986111111111112 | 0 |
| 0.7993055555555556 | 0 |
| 0.7999999999999999 | 0 |
| 0.8006944444444444 | 0 |
| 0.8013888888888889 | 0 |
| 0.8020833333333334 | 0 |
| 0.8027777777777777 | 0 |
| 0.8034722222222223 | 0 |
| 0.8041666666666667 | 0 |
| 0.8048611111111111 | 0 |
| 0.8055555555555555 | 0 |
| 0.80625 | 0 |
| 0.8069444444444445 | 0 |
| 0.8076388888888889 | 0 |
| 0.8083333333333332 | 0 |
| 0.8090277777777778 | 0 |
| 0.8097222222222222 | 0 |
| 0.8104166666666667 | 0 |
| 0.811111111111111 | 0 |
| 0.8118055555555556 | 0 |
| 0.8125 | 0 |
| 0.8131944444444444 | 0 |
| 0.813888888888889 | 0 |
| 0.8145833333333333 | 0 |
| 0.8152777777777778 | 0 |
| 0.8159722222222222 | 0 |
| 0.8166666666666668 | 0 |
| 0.8173611111111111 | 0 |
| 0.8180555555555555 | 0 |
| 0.81875 | 0 |
| 0.8194444444444445 | 0 |
| 0.8201388888888889 | 0 |
| 0.8208333333333333 | 0 |
| 0.8215277777777777 | 0 |
| 0.8222222222222223 | 0 |
| 0.8229166666666666 | 0 |
| 0.8236111111111111 | 0 |
| 0.8243055555555556 | 0 |
| 0.8250000000000001 | 0 |
| 0.8256944444444444 | 0 |
| 0.8263888888888888 | 0 |
| 0.8270833333333334 | 0 |
| 0.8277777777777778 | 0 |
| 0.8284722222222222 | 0 |
| 0.8291666666666666 | 0 |
| 0.8298611111111112 | 0 |
| 0.8305555555555556 | 0 |
| 0.8312499999999999 | 0 |
| 0.8319444444444444 | 0 |
| 0.8326388888888889 | 0 |
| 0.8333333333333334 | 0 |
| 0.8340277777777777 | 0 |
| 0.8347222222222223 | 0 |
| 0.8354166666666667 | 0 |
| 0.8361111111111111 | 0 |
| 0.8368055555555555 | 0 |
| 0.8375 | 0 |
| 0.8381944444444445 | 0 |
| 0.8388888888888889 | 0 |
| 0.8395833333333332 | 0 |
| 0.8402777777777778 | 0 |
| 0.8409722222222222 | 0 |
| 0.8416666666666667 | 0 |
| 0.842361111111111 | 0 |
| 0.8430555555555556 | 0 |
| 0.84375 | 0 |
| 0.8444444444444444 | 0 |
| 0.845138888888889 | 0 |
| 0.8458333333333333 | 0 |
| 0.8465277777777778 | 0 |
| 0.8472222222222222 | 0 |
| 0.8479166666666668 | 0 |
| 0.8486111111111111 | 0 |
| 0.8493055555555555 | 0 |
| 0.85 | 0 |
| 0.8506944444444445 | 0 |
| 0.8513888888888889 | 0 |
| 0.8520833333333333 | 0 |
| 0.8527777777777777 | 0 |
| 0.8534722222222223 | 0 |
| 0.8541666666666666 | 0 |
| 0.8548611111111111 | 0 |
| 0.8555555555555556 | 0 |
| 0.8562500000000001 | 0 |
| 0.8569444444444444 | 0 |
| 0.8576388888888888 | 0 |
| 0.8583333333333334 | 0 |
| 0.8590277777777778 | 0 |
| 0.8597222222222222 | 0 |
| 0.8604166666666666 | 0 |
| 0.8611111111111112 | 0 |
| 0.8618055555555556 | 0 |
| 0.8624999999999999 | 0 |
| 0.8631944444444444 | 0 |
| 0.8638888888888889 | 0 |
| 0.8645833333333334 | 0 |
| 0.8652777777777777 | 0 |
| 0.8659722222222223 | 0 |
| 0.8666666666666667 | 0 |
| 0.8673611111111111 | 0 |
| 0.8680555555555555 | 0 |
| 0.86875 | 0 |
| 0.8694444444444445 | 0 |
| 0.8701388888888889 | 0 |
| 0.8708333333333332 | 0 |
| 0.8715277777777778 | 0 |
| 0.8722222222222222 | 0 |
| 0.8729166666666667 | 0 |
| 0.873611111111111 | 0 |
| 0.8743055555555556 | 0 |
| 0.875 | 0 |
| 0.8756944444444444 | 0 |
| 0.876388888888889 | 0 |
| 0.8770833333333333 | 0 |
| 0.8777777777777778 | 0 |
| 0.8784722222222222 | 0 |
| 0.8791666666666668 | 0 |
| 0.8798611111111111 | 0 |
| 0.8805555555555555 | 0 |
| 0.88125 | 0 |
| 0.8819444444444445 | 0 |
| 0.8826388888888889 | 0 |
| 0.8833333333333333 | 0 |
| 0.8840277777777777 | 0 |
| 0.8847222222222223 | 0 |
| 0.8854166666666666 | 0 |
| 0.8861111111111111 | 0 |
| 0.8868055555555556 | 0 |
| 0.8875000000000001 | 0 |
| 0.8881944444444444 | 0 |
| 0.8888888888888888 | 0 |
| 0.8895833333333334 | 0 |
| 0.8902777777777778 | 0 |
| 0.8909722222222222 | 0 |
| 0.8916666666666666 | 0 |
| 0.8923611111111112 | 0 |
| 0.8930555555555556 | 0 |
| 0.8937499999999999 | 0 |
| 0.8944444444444444 | 0 |
| 0.8951388888888889 | 0 |
| 0.8958333333333334 | 0 |
| 0.8965277777777777 | 0 |
| 0.8972222222222223 | 0 |
| 0.8979166666666667 | 0 |
| 0.8986111111111111 | 0 |
| 0.8993055555555555 | 0 |
| 0.9 | 0 |
| 0.9006944444444445 | 0 |
| 0.9013888888888889 | 0 |
| 0.9020833333333332 | 0 |
| 0.9027777777777778 | 0 |
| 0.9034722222222222 | 0 |
| 0.9041666666666667 | 0 |
| 0.904861111111111 | 0 |
| 0.9055555555555556 | 0 |
| 0.90625 | 0 |
| 0.9069444444444444 | 0 |
| 0.907638888888889 | 0 |
| 0.9083333333333333 | 0 |
| 0.9090277777777778 | 0 |
| 0.9097222222222222 | 0 |
| 0.9104166666666668 | 0 |
| 0.9111111111111111 | 0 |
| 0.9118055555555555 | 0 |
| 0.9125 | 0 |
| 0.9131944444444445 | 0 |
| 0.9138888888888889 | 0 |
| 0.9145833333333333 | 0 |
| 0.9152777777777777 | 0 |
| 0.9159722222222223 | 0 |
| 0.9166666666666666 | 0 |
| 0.9173611111111111 | 0 |
| 0.9180555555555556 | 0 |
| 0.9187500000000001 | 0 |
| 0.9194444444444444 | 0 |
| 0.9201388888888888 | 0 |
| 0.9208333333333334 | 0 |
| 0.9215277777777778 | 0 |
| 0.9222222222222222 | 0 |
| 0.9229166666666666 | 0 |
| 0.9236111111111112 | 0 |
| 0.9243055555555556 | 0 |
| 0.9249999999999999 | 0 |
| 0.9256944444444444 | 0 |
| 0.9263888888888889 | 0 |
| 0.9270833333333334 | 0 |
| 0.9277777777777777 | 0 |
| 0.9284722222222223 | 0 |
| 0.9291666666666667 | 0 |
| 0.9298611111111111 | 0 |
| 0.9305555555555555 | 0 |
| 0.93125 | 0 |
| 0.9319444444444445 | 0 |
| 0.9326388888888889 | 0 |
| 0.9333333333333332 | 0 |
| 0.9340277777777778 | 0 |
| 0.9347222222222222 | 0 |
| 0.9354166666666667 | 0 |
| 0.936111111111111 | 0 |
| 0.9368055555555556 | 0 |
| 0.9375 | 0 |
| 0.9381944444444444 | 0 |
| 0.938888888888889 | 0 |
| 0.9395833333333333 | 0 |
| 0.9402777777777778 | 0 |
| 0.9409722222222222 | 0 |
| 0.9416666666666668 | 0 |
| 0.9423611111111111 | 0 |
| 0.9430555555555555 | 0 |
| 0.94375 | 0 |
| 0.9444444444444445 | 0 |
| 0.9451388888888889 | 0 |
| 0.9458333333333333 | 0 |
| 0.9465277777777777 | 0 |
| 0.9472222222222223 | 0 |
| 0.9479166666666666 | 0 |
| 0.9486111111111111 | 0 |
| 0.9493055555555556 | 0 |
| 0.9500000000000001 | 0 |
| 0.9506944444444444 | 0 |
| 0.9513888888888888 | 0 |
| 0.9520833333333334 | 0 |
| 0.9527777777777778 | 0 |
| 0.9534722222222222 | 0 |
| 0.9541666666666666 | 0 |
| 0.9548611111111112 | 0 |
| 0.9555555555555556 | 0 |
| 0.9562499999999999 | 0 |
| 0.9569444444444444 | 0 |
| 0.9576388888888889 | 0 |
| 0.9583333333333334 | 0 |
| 0.9590277777777777 | 0 |
| 0.9597222222222223 | 0 |
| 0.9604166666666667 | 0 |
| 0.9611111111111111 | 0 |
| 0.9618055555555555 | 0 |
| 0.9625 | 0 |
| 0.9631944444444445 | 0 |
| 0.9638888888888889 | 0 |
| 0.9645833333333332 | 0 |
| 0.9652777777777778 | 0 |
| 0.9659722222222222 | 0 |
| 0.9666666666666667 | 0 |
| 0.967361111111111 | 0 |
| 0.9680555555555556 | 0 |
| 0.96875 | 0 |
| 0.9694444444444444 | 0 |
| 0.970138888888889 | 0 |
| 0.9708333333333333 | 0 |
| 0.9715277777777778 | 0 |
| 0.9722222222222222 | 0 |
| 0.9729166666666668 | 0 |
| 0.9736111111111111 | 0 |
| 0.9743055555555555 | 0 |
| 0.975 | 0 |
| 0.9756944444444445 | 0 |
| 0.9763888888888889 | 0 |
| 0.9770833333333333 | 0 |
| 0.9777777777777777 | 0 |
| 0.9784722222222223 | 0 |
| 0.9791666666666666 | 0 |
| 0.9798611111111111 | 0 |
| 0.9805555555555556 | 0 |
| 0.9812500000000001 | 0 |
| 0.9819444444444444 | 0 |
| 0.9826388888888888 | 0 |
| 0.9833333333333334 | 0 |
| 0.9840277777777778 | 0 |
| 0.9847222222222222 | 0 |
| 0.9854166666666666 | 0 |
| 0.9861111111111112 | 0 |
| 0.9868055555555556 | 0 |
| 0.9874999999999999 | 0 |
| 0.9881944444444444 | 0 |
| 0.9888888888888889 | 0 |
| 0.9895833333333334 | 0 |
| 0.9902777777777777 | 0 |
| 0.9909722222222223 | 0 |
| 0.9916666666666667 | 0 |
| 0.9923611111111111 | 0 |
| 0.9930555555555555 | 0 |
| 0.99375 | 0 |
| 0.9944444444444445 | 0 |
| 0.9951388888888889 | 0 |
| 0.9958333333333332 | 0 |
| 0.9965277777777778 | 0 |
| 0.9972222222222222 | 0 |
| 0.9979166666666667 | 0 |
| 0.998611111111111 | 0 |
| 0.9993055555555556 | 0 |